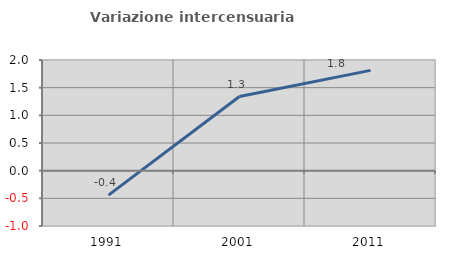
| Category | Variazione intercensuaria annua |
|---|---|
| 1991.0 | -0.443 |
| 2001.0 | 1.339 |
| 2011.0 | 1.812 |